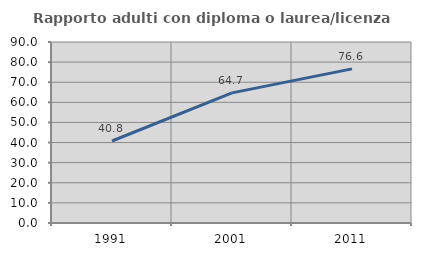
| Category | Rapporto adulti con diploma o laurea/licenza media  |
|---|---|
| 1991.0 | 40.774 |
| 2001.0 | 64.692 |
| 2011.0 | 76.636 |